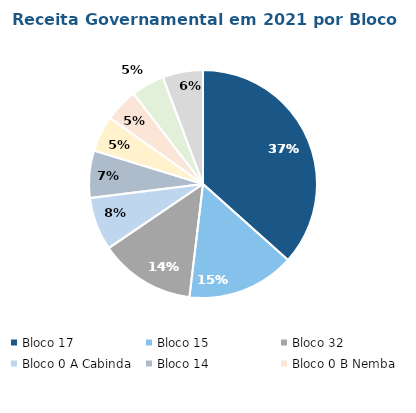
| Category | Peso |
|---|---|
| Bloco 17  | 0.366 |
| Bloco 15  | 0.153 |
| Bloco 32  | 0.136 |
| Bloco 0 A Cabinda  | 0.075 |
| Bloco 14  | 0.067 |
| Bloco 31  | 0.051 |
| Bloco 0 B Nemba  | 0.047 |
| Bloco 15/06  | 0.047 |
| Outros  | 0.057 |